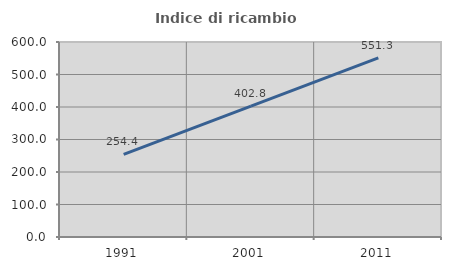
| Category | Indice di ricambio occupazionale  |
|---|---|
| 1991.0 | 254.386 |
| 2001.0 | 402.801 |
| 2011.0 | 551.254 |